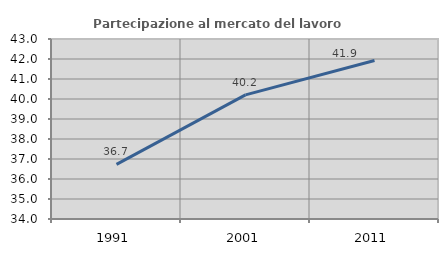
| Category | Partecipazione al mercato del lavoro  femminile |
|---|---|
| 1991.0 | 36.731 |
| 2001.0 | 40.204 |
| 2011.0 | 41.921 |